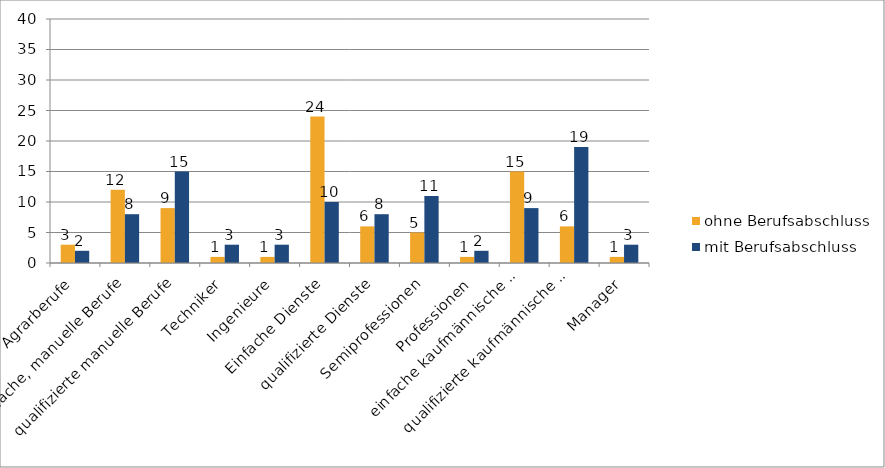
| Category | ohne Berufsabschluss | mit Berufsabschluss |
|---|---|---|
| Agrarberufe | 3 | 2 |
| einfache, manuelle Berufe | 12 | 8 |
| qualifizierte manuelle Berufe | 9 | 15 |
| Techniker | 1 | 3 |
| Ingenieure | 1 | 3 |
| Einfache Dienste | 24 | 10 |
| qualifizierte Dienste | 6 | 8 |
| Semiprofessionen | 5 | 11 |
| Professionen | 1 | 2 |
| einfache kaufmännische 
und Verwaltungsberufe | 15 | 9 |
| qualifizierte kaufmännische 
und Verwaltungsberufe | 6 | 19 |
| Manager | 1 | 3 |